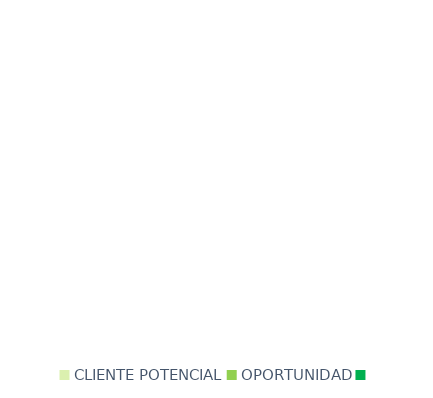
| Category | Series 0 |
|---|---|
| CLIENTE POTENCIAL | 0 |
| OPORTUNIDAD | 0 |